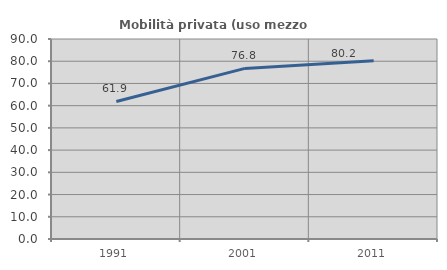
| Category | Mobilità privata (uso mezzo privato) |
|---|---|
| 1991.0 | 61.896 |
| 2001.0 | 76.762 |
| 2011.0 | 80.213 |